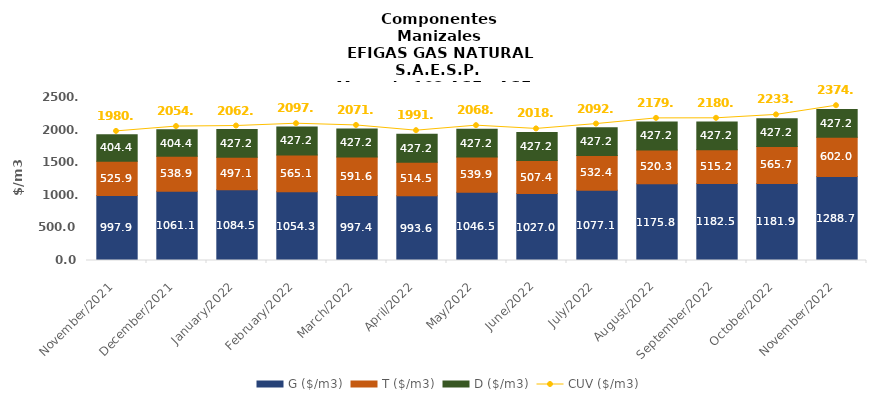
| Category | G ($/m3) | T ($/m3) | D ($/m3) |
|---|---|---|---|
| 2021-11-01 | 997.89 | 525.94 | 404.43 |
| 2021-12-01 | 1061.07 | 538.86 | 404.43 |
| 2022-01-01 | 1084.54 | 497.14 | 427.16 |
| 2022-02-01 | 1054.28 | 565.07 | 427.16 |
| 2022-03-01 | 997.39 | 591.64 | 427.16 |
| 2022-04-01 | 993.58 | 514.51 | 427.16 |
| 2022-05-01 | 1046.51 | 539.86 | 427.16 |
| 2022-06-01 | 1026.97 | 507.37 | 427.16 |
| 2022-07-01 | 1077.11 | 532.44 | 427.16 |
| 2022-08-01 | 1175.82 | 520.33 | 427.16 |
| 2022-09-01 | 1182.5 | 515.15 | 427.16 |
| 2022-10-01 | 1181.88 | 565.72 | 427.16 |
| 2022-11-01 | 1288.68 | 602.02 | 427.16 |